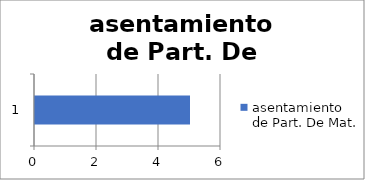
| Category | asentamiento de Part. De Mat. |
|---|---|
| 0 | 5 |